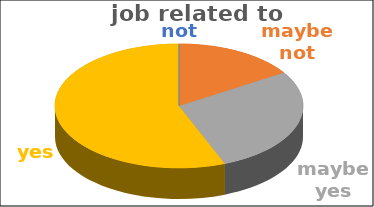
| Category | job related to studies | Series 1 | Series 2 | Series 3 | Series 4 |
|---|---|---|---|---|---|
| not |  |  |  |  |  |
| maybe not |  |  |  |  |  |
| maybe yes |  |  |  |  |  |
| yes |  |  |  |  |  |